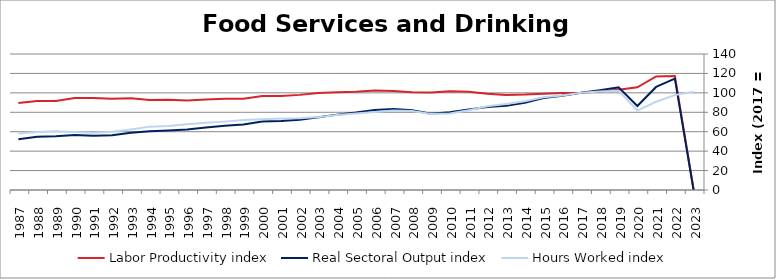
| Category | Labor Productivity index | Real Sectoral Output index | Hours Worked index |
|---|---|---|---|
| 2023.0 | 0 | 0 | 101.165 |
| 2022.0 | 117.424 | 114.68 | 97.663 |
| 2021.0 | 116.854 | 106.107 | 90.803 |
| 2020.0 | 105.749 | 86.484 | 81.782 |
| 2019.0 | 103.276 | 105.627 | 102.277 |
| 2018.0 | 101.312 | 102.821 | 101.489 |
| 2017.0 | 100 | 100 | 100 |
| 2016.0 | 99.795 | 97.135 | 97.335 |
| 2015.0 | 99.177 | 94.592 | 95.376 |
| 2014.0 | 98.282 | 89.786 | 91.356 |
| 2013.0 | 97.819 | 86.606 | 88.537 |
| 2012.0 | 99.055 | 85.322 | 86.136 |
| 2011.0 | 101.114 | 82.956 | 82.041 |
| 2010.0 | 101.701 | 80.045 | 78.706 |
| 2009.0 | 100.352 | 78.487 | 78.212 |
| 2008.0 | 100.686 | 81.982 | 81.424 |
| 2007.0 | 101.925 | 83.447 | 81.871 |
| 2006.0 | 102.505 | 82.426 | 80.412 |
| 2005.0 | 101.259 | 79.78 | 78.788 |
| 2004.0 | 100.558 | 77.585 | 77.154 |
| 2003.0 | 99.774 | 74.853 | 75.022 |
| 2002.0 | 97.924 | 72.27 | 73.802 |
| 2001.0 | 96.77 | 71.13 | 73.504 |
| 2000.0 | 96.757 | 70.539 | 72.904 |
| 1999.0 | 93.847 | 67.543 | 71.972 |
| 1998.0 | 93.965 | 66.142 | 70.389 |
| 1997.0 | 93.082 | 64.326 | 69.106 |
| 1996.0 | 92.084 | 62.226 | 67.575 |
| 1995.0 | 92.927 | 61.32 | 65.987 |
| 1994.0 | 92.749 | 60.501 | 65.231 |
| 1993.0 | 94.336 | 58.85 | 62.383 |
| 1992.0 | 94.05 | 56.383 | 59.95 |
| 1991.0 | 94.585 | 55.826 | 59.022 |
| 1990.0 | 94.788 | 56.655 | 59.77 |
| 1989.0 | 91.596 | 55.392 | 60.474 |
| 1988.0 | 91.693 | 54.785 | 59.748 |
| 1987.0 | 89.563 | 52.187 | 58.268 |